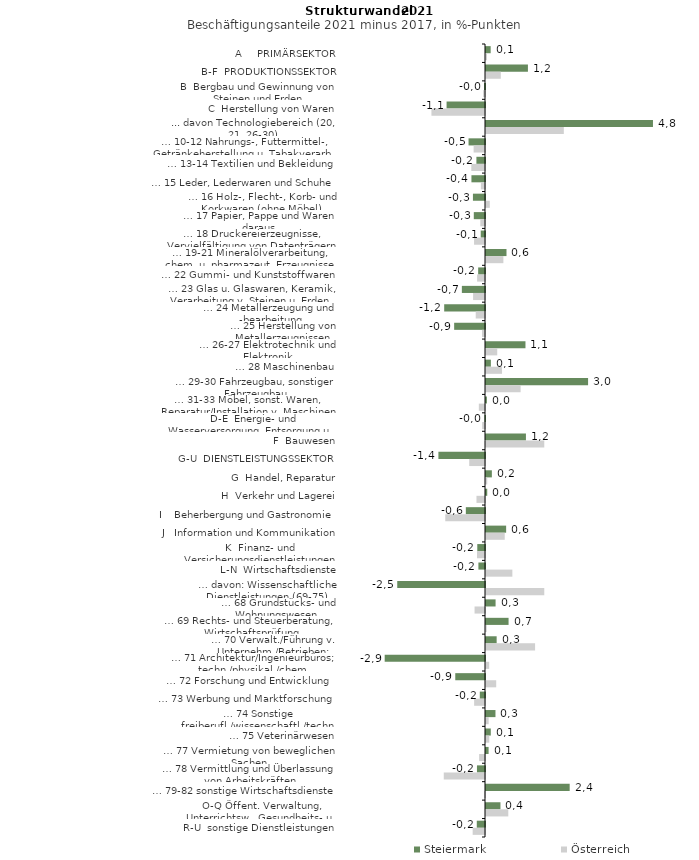
| Category | Steiermark | Österreich |
|---|---|---|
| A     PRIMÄRSEKTOR | 0.135 | 0.029 |
| B-F  PRODUKTIONSSEKTOR | 1.215 | 0.429 |
| B  Bergbau und Gewinnung von Steinen und Erden | -0.029 | -0.054 |
| C  Herstellung von Waren | -1.114 | -1.552 |
| ... davon Technologiebereich (20, 21, 26-30) | 4.84 | 2.256 |
| … 10-12 Nahrungs-, Futtermittel-, Getränkeherstellung u. Tabakverarb. | -0.477 | -0.33 |
| … 13-14 Textilien und Bekleidung | -0.249 | -0.397 |
| … 15 Leder, Lederwaren und Schuhe | -0.393 | -0.119 |
| … 16 Holz-, Flecht-, Korb- und Korkwaren (ohne Möbel)  | -0.35 | 0.11 |
| … 17 Papier, Pappe und Waren daraus  | -0.325 | -0.136 |
| … 18 Druckereierzeugnisse, Vervielfältigung von Datenträgern | -0.124 | -0.317 |
| … 19-21 Mineralölverarbeitung, chem. u. pharmazeut. Erzeugnisse | 0.594 | 0.503 |
| … 22 Gummi- und Kunststoffwaren | -0.198 | -0.229 |
| … 23 Glas u. Glaswaren, Keramik, Verarbeitung v. Steinen u. Erden  | -0.671 | -0.345 |
| … 24 Metallerzeugung und -bearbeitung | -1.183 | -0.269 |
| … 25 Herstellung von Metallerzeugnissen  | -0.894 | -0.086 |
| … 26-27 Elektrotechnik und Elektronik | 1.144 | 0.325 |
| … 28 Maschinenbau | 0.141 | 0.465 |
| … 29-30 Fahrzeugbau, sonstiger Fahrzeugbau | 2.959 | 1.003 |
| … 31-33 Möbel, sonst. Waren, Reparatur/Installation v. Maschinen | 0.026 | -0.178 |
| D-E  Energie- und Wasserversorgung, Entsorgung u. Rückgewinnung | -0.016 | -0.083 |
| F  Bauwesen | 1.158 | 1.689 |
| G-U  DIENSTLEISTUNGSSEKTOR | -1.351 | -0.458 |
| G  Handel, Reparatur | 0.17 | 0.035 |
| H  Verkehr und Lagerei | 0.036 | -0.247 |
| I    Beherbergung und Gastronomie | -0.556 | -1.152 |
| J   Information und Kommunikation | 0.584 | 0.543 |
| K  Finanz- und Versicherungsdienstleistungen | -0.224 | -0.232 |
| L-N  Wirtschaftsdienste | -0.191 | 0.764 |
| … davon: Wissenschaftliche Dienstleistungen (69-75) | -2.544 | 1.689 |
| … 68 Grundstücks- und Wohnungswesen  | 0.278 | -0.302 |
| … 69 Rechts- und Steuerberatung, Wirtschaftsprüfung | 0.654 | 0.021 |
| … 70 Verwalt./Führung v. Unternehm./Betrieben; Unternehmensberat. | 0.309 | 1.422 |
| … 71 Architektur/Ingenieurbüros; techn./physikal./chem. Untersuchung | -2.908 | 0.093 |
| … 72 Forschung und Entwicklung  | -0.862 | 0.296 |
| … 73 Werbung und Marktforschung | -0.151 | -0.315 |
| … 74 Sonstige freiberufl./wissenschaftl./techn. Tätigkeiten | 0.275 | 0.077 |
| … 75 Veterinärwesen | 0.139 | 0.095 |
| … 77 Vermietung von beweglichen Sachen  | 0.075 | -0.17 |
| … 78 Vermittlung und Überlassung von Arbeitskräften | -0.233 | -1.195 |
| … 79-82 sonstige Wirtschaftsdienste | 2.426 | -0.022 |
| O-Q Öffent. Verwaltung, Unterrichtsw., Gesundheits- u. Sozialwesen | 0.419 | 0.646 |
| R-U  sonstige Dienstleistungen | -0.238 | -0.357 |